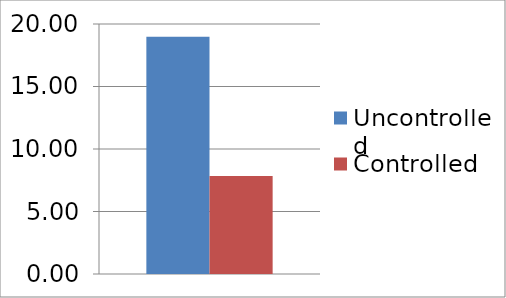
| Category | Uncontrolled | Controlled |
|---|---|---|
| 0 | 18.97 | 7.85 |